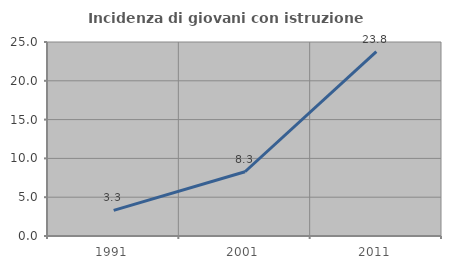
| Category | Incidenza di giovani con istruzione universitaria |
|---|---|
| 1991.0 | 3.306 |
| 2001.0 | 8.28 |
| 2011.0 | 23.762 |